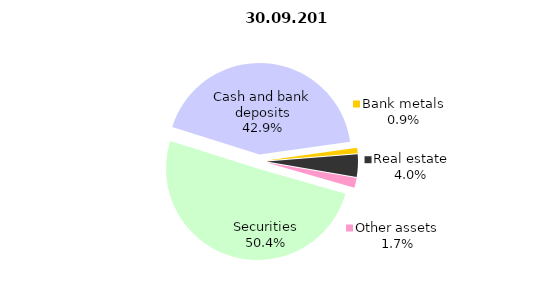
| Category | 30.09.2016 |
|---|---|
| Securities | 518895266.136 |
| Cash and bank deposits | 441716172.527 |
| Bank metals | 9584421.2 |
| Real estate | 41259041.65 |
| Other assets | 17654872.18 |